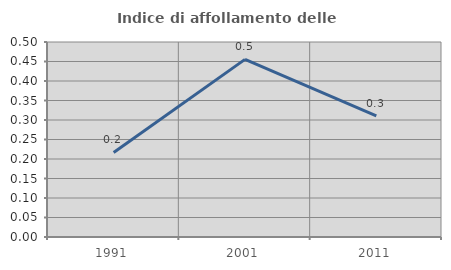
| Category | Indice di affollamento delle abitazioni  |
|---|---|
| 1991.0 | 0.217 |
| 2001.0 | 0.455 |
| 2011.0 | 0.311 |